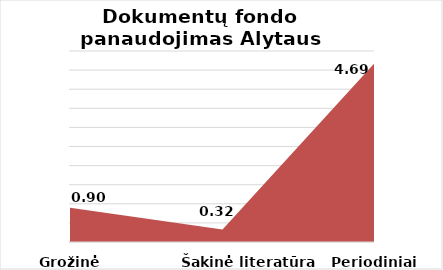
| Category | Series 0 |
|---|---|
| Grožinė literatūra | 0.896 |
| Šakinė literatūra | 0.325 |
| Periodiniai leidiniai | 4.694 |